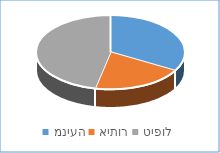
| Category | Series 0 |
|---|---|
| מניעה | 5 |
| איתור | 3 |
| טיפול | 7 |